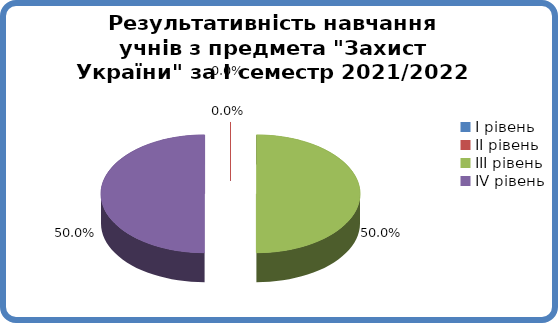
| Category | Series 0 |
|---|---|
| 0 | 0 |
| 1 | 0 |
| 2 | 0.5 |
| 3 | 0.5 |